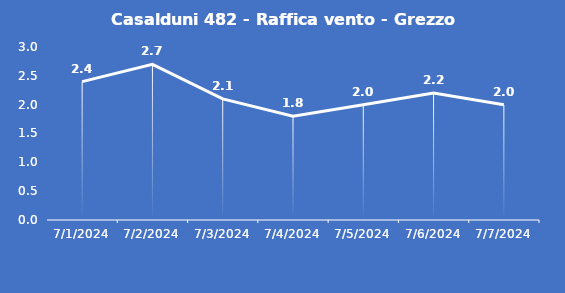
| Category | Casalduni 482 - Raffica vento - Grezzo (m/s) |
|---|---|
| 7/1/24 | 2.4 |
| 7/2/24 | 2.7 |
| 7/3/24 | 2.1 |
| 7/4/24 | 1.8 |
| 7/5/24 | 2 |
| 7/6/24 | 2.2 |
| 7/7/24 | 2 |